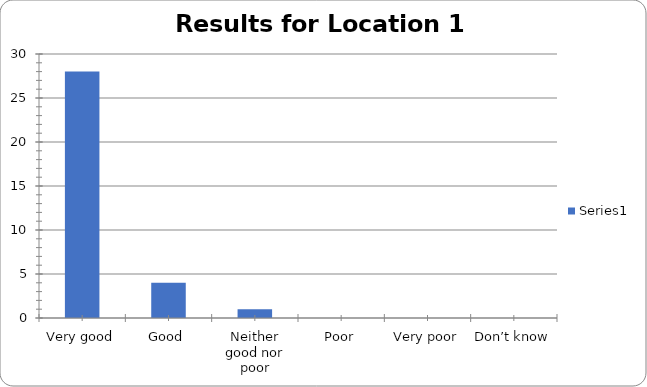
| Category | Series 0 |
|---|---|
| Very good | 28 |
| Good | 4 |
| Neither good nor poor | 1 |
| Poor | 0 |
| Very poor | 0 |
| Don’t know | 0 |